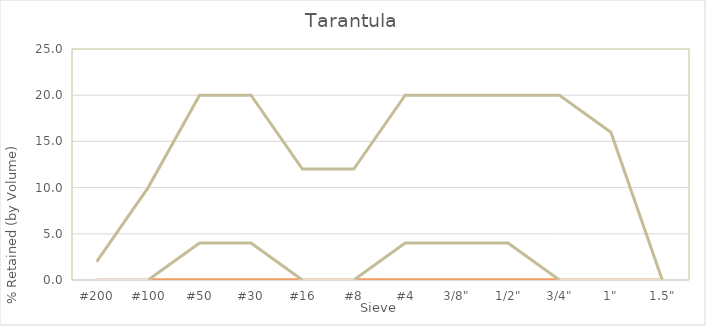
| Category | Series 0 | Min | Max |
|---|---|---|---|
| 1.5" | 0 | 0 | 0 |
| 1" | 0 | 0 | 16 |
| 3/4" | 0 | 0 | 20 |
| 1/2" | 0 | 4 | 20 |
| 3/8" | 0 | 4 | 20 |
| #4 | 0 | 4 | 20 |
| #8 | 0 | 0 | 12 |
| #16 | 0 | 0 | 12 |
| #30 | 0 | 4 | 20 |
| #50 | 0 | 4 | 20 |
| #100 | 0 | 0 | 10 |
| #200 | 0 | 0 | 2 |